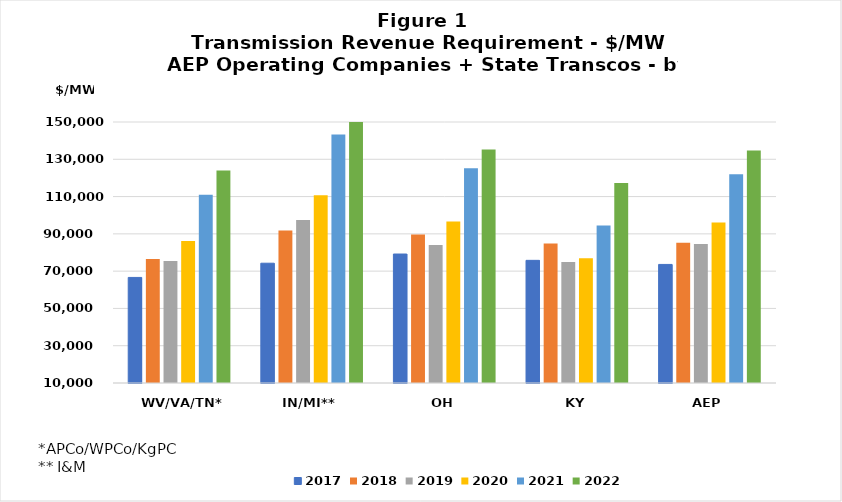
| Category | 2017 | 2018 | 2019 | 2020 | 2021 | 2022 |
|---|---|---|---|---|---|---|
|  WV/VA/TN*  | 66628.279 | 76487.565 | 75417.679 | 86109.619 | 111015.236 | 124031.739 |
|  IN/MI**  | 74255.312 | 91739.018 | 97382.125 | 110768.807 | 143253.371 | 158120.297 |
|  OH  | 79182.878 | 89707.394 | 84061.56 | 96581.686 | 125146.614 | 135309.817 |
|  KY  | 75791.583 | 84768.034 | 74852.259 | 76937.644 | 94428.949 | 117291.536 |
|  AEP  | 73597.012 | 85293.502 | 84586.177 | 96028.363 | 121983.946 | 134686.019 |